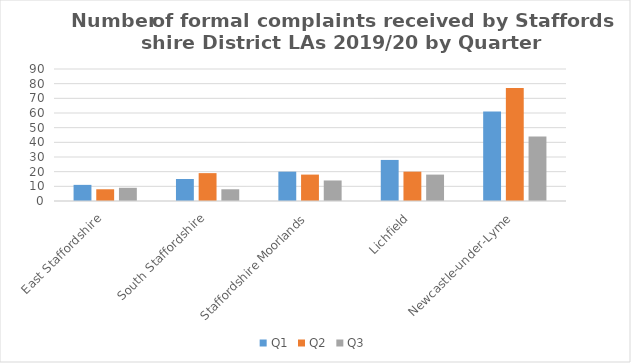
| Category | Q1 | Q2 | Q3 |
|---|---|---|---|
| East Staffordshire | 11 | 8 | 9 |
| South Staffordshire | 15 | 19 | 8 |
| Staffordshire Moorlands | 20 | 18 | 14 |
| Lichfield | 28 | 20 | 18 |
| Newcastle-under-Lyme | 61 | 77 | 44 |